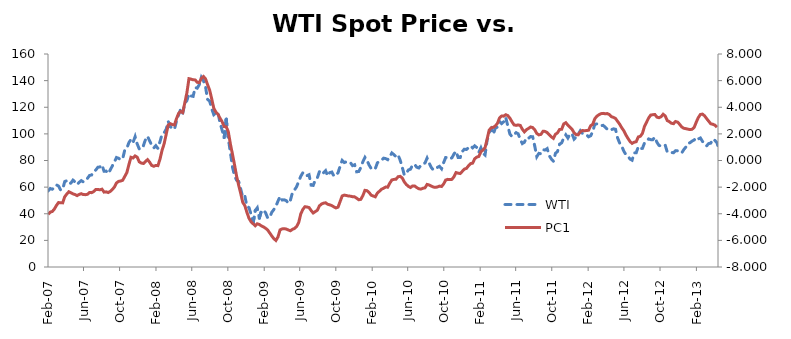
| Category | WTI |
|---|---|
| 2007-02-02 | 57.11 |
| 2007-02-09 | 58.99 |
| 2007-02-16 | 58.41 |
| 2007-02-23 | 59.57 |
| 2007-03-02 | 61.64 |
| 2007-03-09 | 60.85 |
| 2007-03-16 | 57.94 |
| 2007-03-23 | 58.26 |
| 2007-03-30 | 64.18 |
| 2007-04-06 | 64.82 |
| 2007-04-13 | 62.58 |
| 2007-04-20 | 63.06 |
| 2007-04-27 | 65.26 |
| 2007-05-04 | 63.82 |
| 2007-05-11 | 61.9 |
| 2007-05-18 | 63.61 |
| 2007-05-25 | 64.89 |
| 2007-06-01 | 63.94 |
| 2007-06-08 | 65.9 |
| 2007-06-15 | 66.62 |
| 2007-06-22 | 68.78 |
| 2007-06-29 | 69.13 |
| 2007-07-06 | 71.78 |
| 2007-07-13 | 72.79 |
| 2007-07-20 | 74.92 |
| 2007-07-27 | 75.15 |
| 2007-08-03 | 76.75 |
| 2007-08-10 | 71.92 |
| 2007-08-17 | 72.05 |
| 2007-08-24 | 70.19 |
| 2007-08-31 | 72.93 |
| 2007-09-07 | 75.96 |
| 2007-09-14 | 78.95 |
| 2007-09-21 | 82.26 |
| 2007-09-28 | 81.7 |
| 2007-10-05 | 80.59 |
| 2007-10-12 | 81.46 |
| 2007-10-19 | 87.8 |
| 2007-10-26 | 89.23 |
| 2007-11-02 | 93.46 |
| 2007-11-09 | 95.81 |
| 2007-11-16 | 93.56 |
| 2007-11-23 | 97.93 |
| 2007-11-30 | 92.47 |
| 2007-12-07 | 88.71 |
| 2007-12-14 | 91.18 |
| 2007-12-21 | 91.16 |
| 2007-12-28 | 95.64 |
| 2008-01-04 | 98.17 |
| 2008-01-11 | 94.76 |
| 2008-01-18 | 91.51 |
| 2008-01-25 | 89.41 |
| 2008-02-01 | 91.14 |
| 2008-02-08 | 89.08 |
| 2008-02-15 | 94.13 |
| 2008-02-22 | 99.61 |
| 2008-02-29 | 100.84 |
| 2008-03-07 | 103.44 |
| 2008-03-14 | 109.35 |
| 2008-03-21 | 105.28 |
| 2008-03-28 | 104.49 |
| 2008-04-04 | 103.46 |
| 2008-04-11 | 109.71 |
| 2008-04-18 | 114.33 |
| 2008-04-25 | 118.53 |
| 2008-05-02 | 115.42 |
| 2008-05-09 | 123.01 |
| 2008-05-16 | 124.96 |
| 2008-05-23 | 130.14 |
| 2008-05-30 | 128.47 |
| 2008-06-06 | 128.16 |
| 2008-06-13 | 134.8 |
| 2008-06-20 | 134.34 |
| 2008-06-27 | 137 |
| 2008-07-04 | 142.52 |
| 2008-07-11 | 139.95 |
| 2008-07-18 | 135.37 |
| 2008-07-25 | 125.92 |
| 2008-08-01 | 124.57 |
| 2008-08-08 | 118.8 |
| 2008-08-15 | 114.4 |
| 2008-08-22 | 115.7 |
| 2008-08-29 | 116.09 |
| 2008-09-05 | 108.37 |
| 2008-09-12 | 102.88 |
| 2008-09-19 | 97.19 |
| 2008-09-26 | 111.12 |
| 2008-10-03 | 96.59 |
| 2008-10-10 | 86.24 |
| 2008-10-17 | 75.19 |
| 2008-10-24 | 68.56 |
| 2008-10-31 | 65.21 |
| 2008-11-07 | 64.31 |
| 2008-11-14 | 58.6 |
| 2008-11-21 | 52.26 |
| 2008-11-28 | 53.27 |
| 2008-12-05 | 45.6 |
| 2008-12-12 | 44.57 |
| 2008-12-19 | 39.7 |
| 2008-12-26 | 32.98 |
| 2009-01-02 | 42.4 |
| 2009-01-09 | 44.46 |
| 2009-01-16 | 36.73 |
| 2009-01-23 | 42.15 |
| 2009-01-30 | 42.7 |
| 2009-02-06 | 40.78 |
| 2009-02-13 | 36.94 |
| 2009-02-20 | 37.15 |
| 2009-02-27 | 41.1 |
| 2009-03-06 | 43.18 |
| 2009-03-13 | 45.66 |
| 2009-03-20 | 49.49 |
| 2009-03-27 | 52.99 |
| 2009-04-03 | 50.34 |
| 2009-04-10 | 50.46 |
| 2009-04-17 | 49.86 |
| 2009-04-24 | 47.8 |
| 2009-05-01 | 50.2 |
| 2009-05-08 | 55.96 |
| 2009-05-15 | 57.94 |
| 2009-05-22 | 60.32 |
| 2009-05-29 | 64.32 |
| 2009-06-05 | 68.11 |
| 2009-06-12 | 70.85 |
| 2009-06-19 | 70.62 |
| 2009-06-26 | 68.58 |
| 2009-07-03 | 69.32 |
| 2009-07-10 | 61.48 |
| 2009-07-17 | 61.29 |
| 2009-07-24 | 65.28 |
| 2009-07-31 | 67.03 |
| 2009-08-07 | 71.58 |
| 2009-08-14 | 69.64 |
| 2009-08-21 | 70.8 |
| 2009-08-28 | 72.37 |
| 2009-09-04 | 68.39 |
| 2009-09-11 | 70.91 |
| 2009-09-18 | 71.32 |
| 2009-09-25 | 68.33 |
| 2009-10-02 | 68.84 |
| 2009-10-09 | 70.8 |
| 2009-10-16 | 75.73 |
| 2009-10-23 | 80.06 |
| 2009-10-30 | 78.47 |
| 2009-11-06 | 79 |
| 2009-11-13 | 78.24 |
| 2009-11-20 | 78.37 |
| 2009-11-27 | 76.14 |
| 2009-12-04 | 76.81 |
| 2009-12-11 | 71.51 |
| 2009-12-18 | 71.72 |
| 2009-12-25 | 74.76 |
| 2010-01-01 | 79.07 |
| 2010-01-08 | 82.34 |
| 2010-01-15 | 80.06 |
| 2010-01-22 | 76.62 |
| 2010-01-29 | 73.94 |
| 2010-02-05 | 74.57 |
| 2010-02-12 | 73.88 |
| 2010-02-19 | 78.25 |
| 2010-02-26 | 79.22 |
| 2010-03-05 | 80.19 |
| 2010-03-12 | 81.76 |
| 2010-03-19 | 81.44 |
| 2010-03-26 | 80.65 |
| 2010-04-02 | 83.01 |
| 2010-04-09 | 85.66 |
| 2010-04-16 | 84.34 |
| 2010-04-23 | 82.9 |
| 2010-04-30 | 84.22 |
| 2010-05-07 | 80.24 |
| 2010-05-14 | 74.98 |
| 2010-05-21 | 69.14 |
| 2010-05-28 | 70.62 |
| 2010-06-04 | 72.91 |
| 2010-06-11 | 73.44 |
| 2010-06-18 | 76.7 |
| 2010-06-25 | 77.06 |
| 2010-07-02 | 74.96 |
| 2010-07-09 | 74.39 |
| 2010-07-16 | 76.35 |
| 2010-07-23 | 77.56 |
| 2010-07-30 | 78.12 |
| 2010-08-06 | 81.79 |
| 2010-08-13 | 78.17 |
| 2010-08-20 | 74.84 |
| 2010-08-27 | 72.91 |
| 2010-09-03 | 74.02 |
| 2010-09-10 | 74.82 |
| 2010-09-17 | 75.62 |
| 2010-09-24 | 73.76 |
| 2010-10-01 | 78.41 |
| 2010-10-08 | 82.29 |
| 2010-10-15 | 82.16 |
| 2010-10-22 | 81.15 |
| 2010-10-29 | 82.03 |
| 2010-11-05 | 84.93 |
| 2010-11-12 | 86.91 |
| 2010-11-19 | 82.23 |
| 2010-11-26 | 82.28 |
| 2010-12-03 | 86.75 |
| 2010-12-10 | 88.5 |
| 2010-12-17 | 88.27 |
| 2010-12-24 | 89.66 |
| 2010-12-31 | 90.97 |
| 2011-01-07 | 89.54 |
| 2011-01-14 | 91.02 |
| 2011-01-21 | 89.75 |
| 2011-01-28 | 86.11 |
| 2011-02-04 | 89.52 |
| 2011-02-11 | 85.51 |
| 2011-02-18 | 84.13 |
| 2011-02-25 | 95.26 |
| 2011-03-04 | 101.05 |
| 2011-03-11 | 103.74 |
| 2011-03-18 | 99.79 |
| 2011-03-25 | 104.41 |
| 2011-04-01 | 105.08 |
| 2011-04-08 | 109.29 |
| 2011-04-15 | 107.75 |
| 2011-04-22 | 109.11 |
| 2011-04-29 | 112.3 |
| 2011-05-06 | 105.84 |
| 2011-05-13 | 99.87 |
| 2011-05-20 | 97.99 |
| 2011-05-27 | 99.55 |
| 2011-06-03 | 100.92 |
| 2011-06-10 | 100.05 |
| 2011-06-17 | 95.87 |
| 2011-06-24 | 92.7 |
| 2011-07-01 | 93.7 |
| 2011-07-08 | 97.12 |
| 2011-07-15 | 96.72 |
| 2011-07-22 | 98.01 |
| 2011-07-29 | 97.83 |
| 2011-08-05 | 90.85 |
| 2011-08-12 | 82.86 |
| 2011-08-19 | 85.36 |
| 2011-08-26 | 85.06 |
| 2011-09-02 | 88.07 |
| 2011-09-09 | 87.91 |
| 2011-09-16 | 88.93 |
| 2011-09-23 | 83.65 |
| 2011-09-30 | 81.18 |
| 2011-10-07 | 79.43 |
| 2011-10-14 | 85.35 |
| 2011-10-21 | 86.82 |
| 2011-10-28 | 92.32 |
| 2011-11-04 | 93.24 |
| 2011-11-11 | 96.97 |
| 2011-11-18 | 99.32 |
| 2011-11-25 | 96.89 |
| 2011-12-02 | 99.91 |
| 2011-12-09 | 100.08 |
| 2011-12-16 | 96.06 |
| 2011-12-23 | 97.74 |
| 2011-12-30 | 99.81 |
| 2012-01-06 | 102.39 |
| 2012-01-13 | 100.43 |
| 2012-01-20 | 99.95 |
| 2012-01-27 | 99.35 |
| 2012-02-03 | 97.8 |
| 2012-02-10 | 98.56 |
| 2012-02-17 | 101.73 |
| 2012-02-24 | 107.18 |
| 2012-03-02 | 107.52 |
| 2012-03-09 | 106.32 |
| 2012-03-16 | 106.15 |
| 2012-03-23 | 106.41 |
| 2012-03-30 | 105.12 |
| 2012-04-06 | 103.52 |
| 2012-04-13 | 102.55 |
| 2012-04-20 | 103.15 |
| 2012-04-27 | 103.78 |
| 2012-05-04 | 103.47 |
| 2012-05-11 | 96.98 |
| 2012-05-18 | 93.11 |
| 2012-05-25 | 90.88 |
| 2012-06-01 | 87.06 |
| 2012-06-08 | 84.43 |
| 2012-06-15 | 83.27 |
| 2012-06-22 | 81.11 |
| 2012-06-29 | 80.23 |
| 2012-07-06 | 85.74 |
| 2012-07-13 | 85.78 |
| 2012-07-20 | 90.34 |
| 2012-07-27 | 88.88 |
| 2012-08-03 | 89.1 |
| 2012-08-10 | 93.14 |
| 2012-08-17 | 94.43 |
| 2012-08-24 | 96.22 |
| 2012-08-31 | 95.68 |
| 2012-09-07 | 95.68 |
| 2012-09-14 | 97.56 |
| 2012-09-21 | 93.7 |
| 2012-09-28 | 91.35 |
| 2012-10-05 | 90.81 |
| 2012-10-12 | 91.42 |
| 2012-10-19 | 91.59 |
| 2012-10-26 | 86.35 |
| 2012-11-02 | 85.87 |
| 2012-11-09 | 85.98 |
| 2012-11-16 | 85.87 |
| 2012-11-23 | 87.4 |
| 2012-11-30 | 87.27 |
| 2012-12-07 | 87 |
| 2012-12-14 | 85.71 |
| 2012-12-21 | 88.24 |
| 2012-12-28 | 90.14 |
| 2013-01-04 | 92.77 |
| 2013-01-11 | 93.38 |
| 2013-01-18 | 94.58 |
| 2013-01-25 | 95.41 |
| 2013-02-01 | 97.33 |
| 2013-02-08 | 96.18 |
| 2013-02-15 | 96.95 |
| 2013-02-22 | 94.38 |
| 2013-03-01 | 92.19 |
| 2013-03-08 | 91 |
| 2013-03-15 | 92.7 |
| 2013-03-22 | 93.05 |
| 2013-03-29 | 96.08 |
| 2013-04-05 | 95.07 |
| 2013-04-12 | 93.36 |
| 2013-04-19 | 88 |
| 2013-04-26 | 91 |
| 2013-05-03 | 93.4 |
| 2013-05-10 | 95.84 |
| 2013-05-17 | 94.65 |